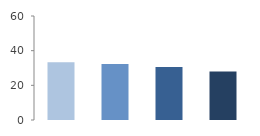
| Category | Rate (%) |
|---|---|
| 2009.0 | 33.345 |
| 2010.0 | 32.298 |
| 2011.0 | 30.616 |
| 2012.0 | 27.978 |